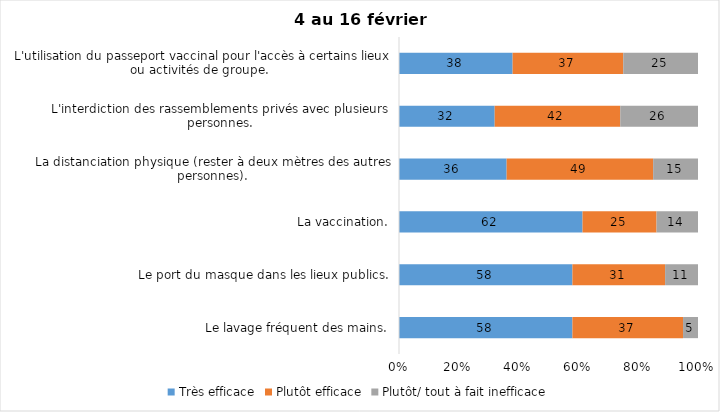
| Category | Très efficace | Plutôt efficace | Plutôt/ tout à fait inefficace |
|---|---|---|---|
| Le lavage fréquent des mains. | 58 | 37 | 5 |
| Le port du masque dans les lieux publics. | 58 | 31 | 11 |
| La vaccination. | 62 | 25 | 14 |
| La distanciation physique (rester à deux mètres des autres personnes). | 36 | 49 | 15 |
| L'interdiction des rassemblements privés avec plusieurs personnes. | 32 | 42 | 26 |
| L'utilisation du passeport vaccinal pour l'accès à certains lieux ou activités de groupe.  | 38 | 37 | 25 |